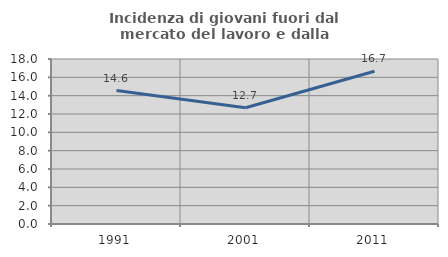
| Category | Incidenza di giovani fuori dal mercato del lavoro e dalla formazione  |
|---|---|
| 1991.0 | 14.563 |
| 2001.0 | 12.676 |
| 2011.0 | 16.667 |